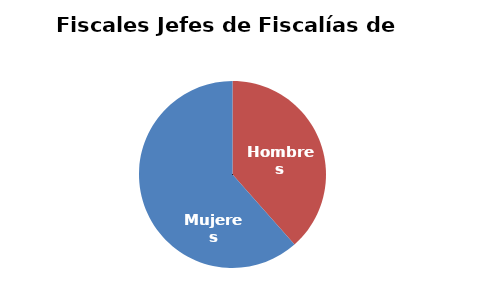
| Category | Fiscales Jefes de Fiscalías de Área  |
|---|---|
| Hombres | 10 |
| Mujeres | 16 |